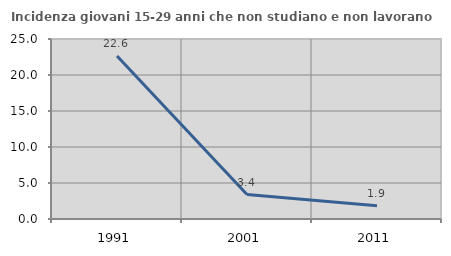
| Category | Incidenza giovani 15-29 anni che non studiano e non lavorano  |
|---|---|
| 1991.0 | 22.63 |
| 2001.0 | 3.39 |
| 2011.0 | 1.852 |